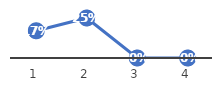
| Category | Series 0 |
|---|---|
| 0 | 0.17 |
| 1 | 0.25 |
| 2 | 0 |
| 3 | 0 |